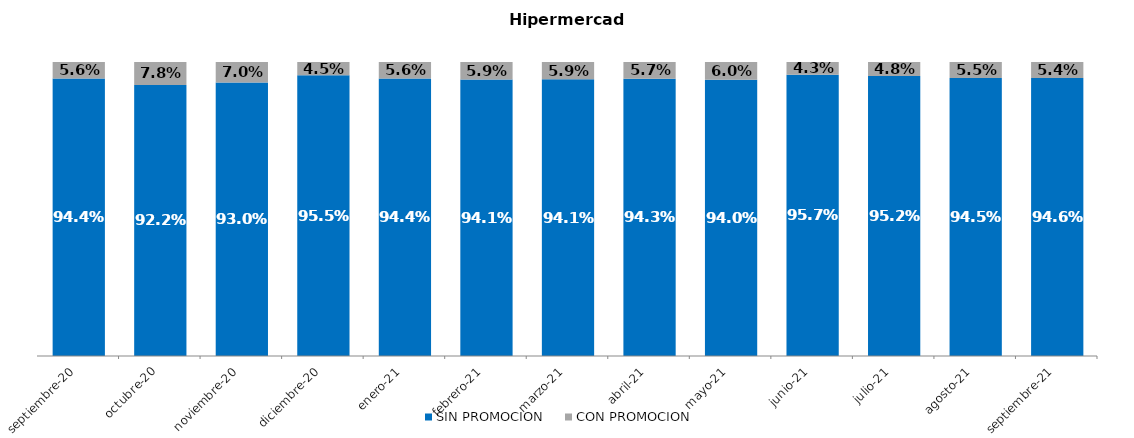
| Category | SIN PROMOCION   | CON PROMOCION   |
|---|---|---|
| 2020-09-01 | 0.944 | 0.056 |
| 2020-10-01 | 0.922 | 0.078 |
| 2020-11-01 | 0.93 | 0.07 |
| 2020-12-01 | 0.955 | 0.045 |
| 2021-01-01 | 0.944 | 0.056 |
| 2021-02-01 | 0.941 | 0.059 |
| 2021-03-01 | 0.941 | 0.059 |
| 2021-04-01 | 0.943 | 0.057 |
| 2021-05-01 | 0.94 | 0.06 |
| 2021-06-01 | 0.957 | 0.043 |
| 2021-07-01 | 0.952 | 0.048 |
| 2021-08-01 | 0.945 | 0.055 |
| 2021-09-01 | 0.946 | 0.054 |